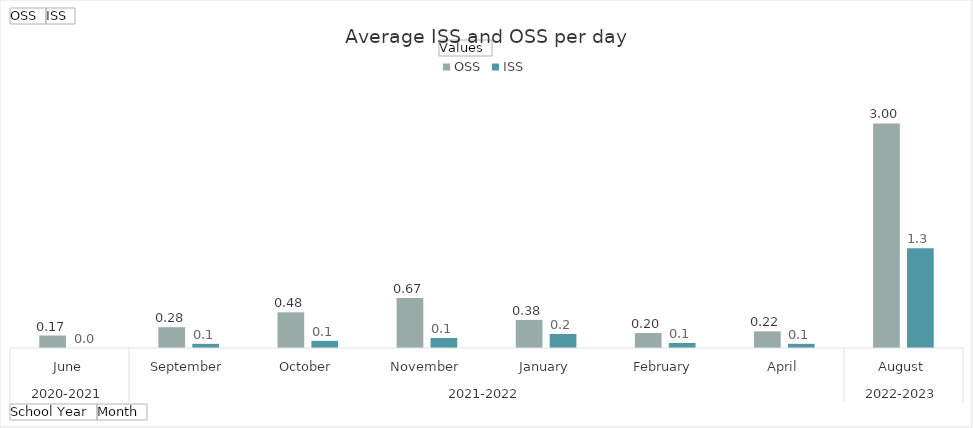
| Category | OSS | ISS |
|---|---|---|
| 0 | 0.167 | 0 |
| 1 | 0.278 | 0.056 |
| 2 | 0.476 | 0.095 |
| 3 | 0.667 | 0.133 |
| 4 | 0.375 | 0.188 |
| 5 | 0.2 | 0.067 |
| 6 | 0.222 | 0.056 |
| 7 | 3 | 1.333 |